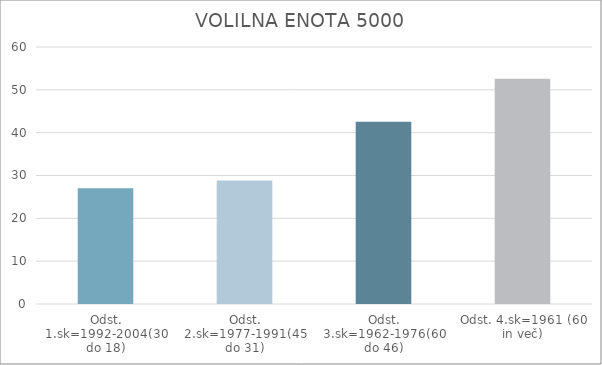
| Category | Series 0 |
|---|---|
| Odst. 1.sk=1992-2004(30 do 18) | 27 |
| Odst. 2.sk=1977-1991(45 do 31) | 28.83 |
| Odst. 3.sk=1962-1976(60 do 46) | 42.55 |
| Odst. 4.sk=1961 (60 in več) | 52.59 |